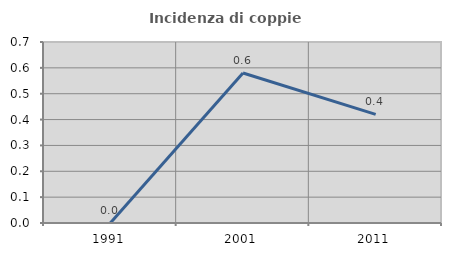
| Category | Incidenza di coppie miste |
|---|---|
| 1991.0 | 0 |
| 2001.0 | 0.58 |
| 2011.0 | 0.42 |